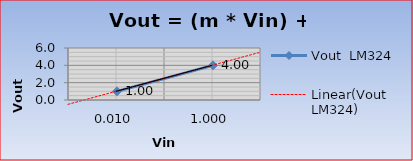
| Category | Vout  LM324 |
|---|---|
| 0.01 | 1 |
| 1.0 | 4 |